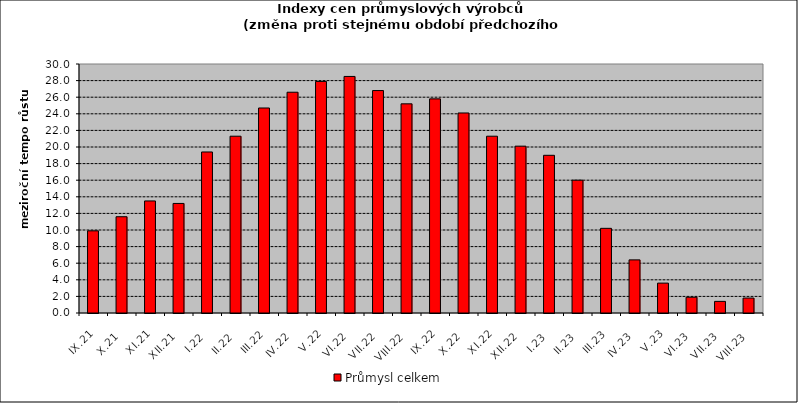
| Category | Průmysl celkem |
|---|---|
| IX.21 | 9.9 |
| X.21 | 11.6 |
| XI.21 | 13.5 |
| XII.21 | 13.2 |
| I.22 | 19.4 |
| II.22 | 21.3 |
| III.22 | 24.7 |
| IV.22 | 26.6 |
| V.22 | 27.9 |
| VI.22 | 28.5 |
| VII.22 | 26.8 |
| VIII.22 | 25.2 |
| IX.22 | 25.8 |
| X.22 | 24.1 |
| XI.22 | 21.3 |
| XII.22 | 20.1 |
| I.23 | 19 |
| II.23 | 16 |
| III.23 | 10.2 |
| IV.23 | 6.4 |
| V.23 | 3.6 |
| VI.23 | 1.9 |
| VII.23 | 1.4 |
| VIII.23 | 1.8 |